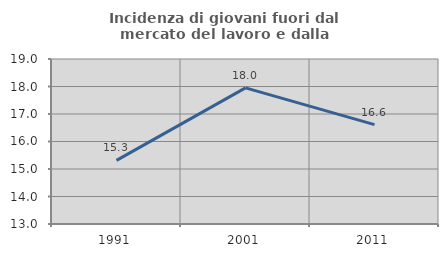
| Category | Incidenza di giovani fuori dal mercato del lavoro e dalla formazione  |
|---|---|
| 1991.0 | 15.313 |
| 2001.0 | 17.952 |
| 2011.0 | 16.612 |